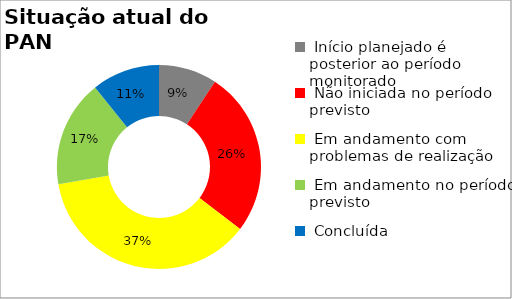
| Category | Series 0 |
|---|---|
|  Início planejado é posterior ao período monitorado | 0.092 |
|  Não iniciada no período previsto | 0.262 |
|  Em andamento com problemas de realização | 0.369 |
|  Em andamento no período previsto  | 0.169 |
|  Concluída | 0.108 |